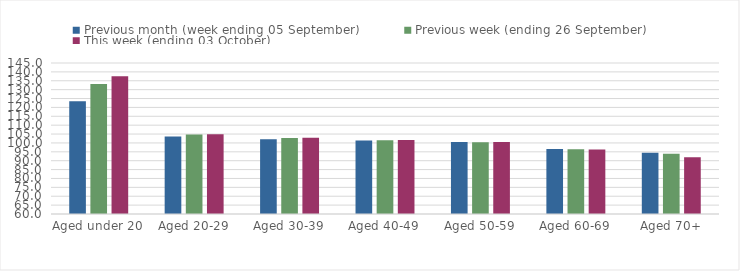
| Category | Previous month (week ending 05 September) | Previous week (ending 26 September) | This week (ending 03 October) |
|---|---|---|---|
| Aged under 20 | 123.4 | 133.15 | 137.52 |
| Aged 20-29 | 103.66 | 104.73 | 104.91 |
| Aged 30-39 | 102.04 | 102.75 | 102.96 |
| Aged 40-49 | 101.39 | 101.48 | 101.68 |
| Aged 50-59 | 100.5 | 100.38 | 100.5 |
| Aged 60-69 | 96.56 | 96.44 | 96.3 |
| Aged 70+ | 94.43 | 93.87 | 91.88 |